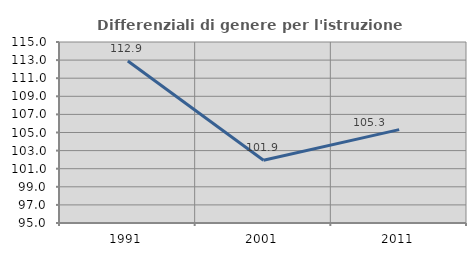
| Category | Differenziali di genere per l'istruzione superiore |
|---|---|
| 1991.0 | 112.906 |
| 2001.0 | 101.931 |
| 2011.0 | 105.319 |